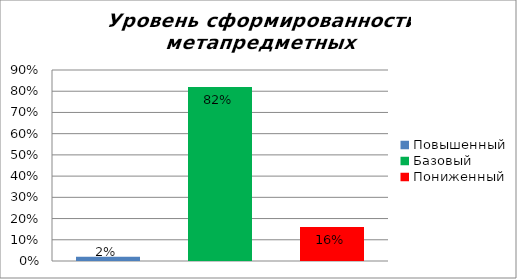
| Category | Уровень сформированности метапредметных результатов |
|---|---|
| Повышенный | 0.02 |
| Базовый | 0.82 |
| Пониженный | 0.16 |